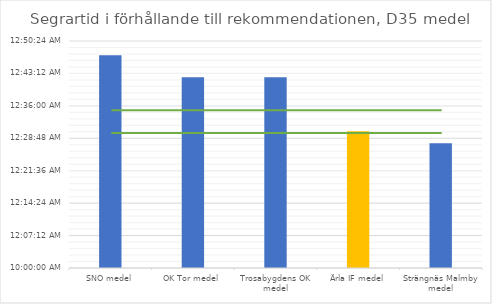
| Category | D35 tid |
|---|---|
| SNO medel | 0.033 |
| OK Tor medel | 0.029 |
| Trosabygdens OK medel | 0.029 |
| Ärla IF medel | 0.021 |
| Strängnäs Malmby medel | 0.019 |